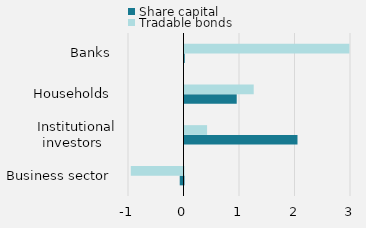
| Category | Share capital | Tradable bonds |
|---|---|---|
| Business sector | -67.799 | -949.638 |
| Institutional investors | 2035.802 | 406.961 |
| Households | 941 | 1247.226 |
| Banks | 4 | 2971 |